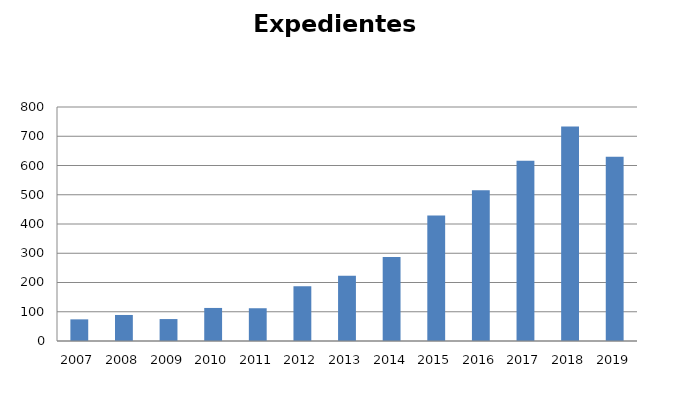
| Category | Expedientes Gubernativos |
|---|---|
| 2007.0 | 74 |
| 2008.0 | 89 |
| 2009.0 | 75 |
| 2010.0 | 113 |
| 2011.0 | 112 |
| 2012.0 | 187 |
| 2013.0 | 223 |
| 2014.0 | 287 |
| 2015.0 | 429 |
| 2016.0 | 515 |
| 2017.0 | 616 |
| 2018.0 | 733 |
| 2019.0 | 630 |